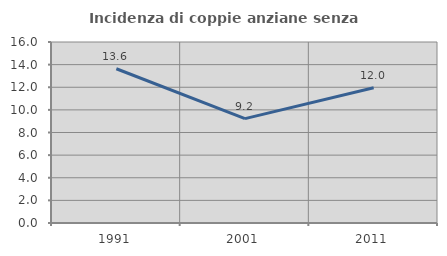
| Category | Incidenza di coppie anziane senza figli  |
|---|---|
| 1991.0 | 13.636 |
| 2001.0 | 9.226 |
| 2011.0 | 11.953 |